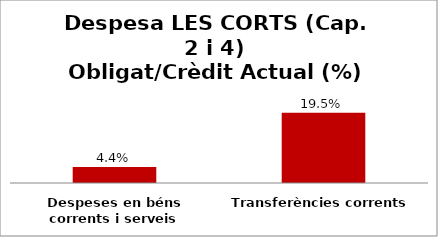
| Category | Series 0 |
|---|---|
| Despeses en béns corrents i serveis | 0.044 |
| Transferències corrents | 0.195 |